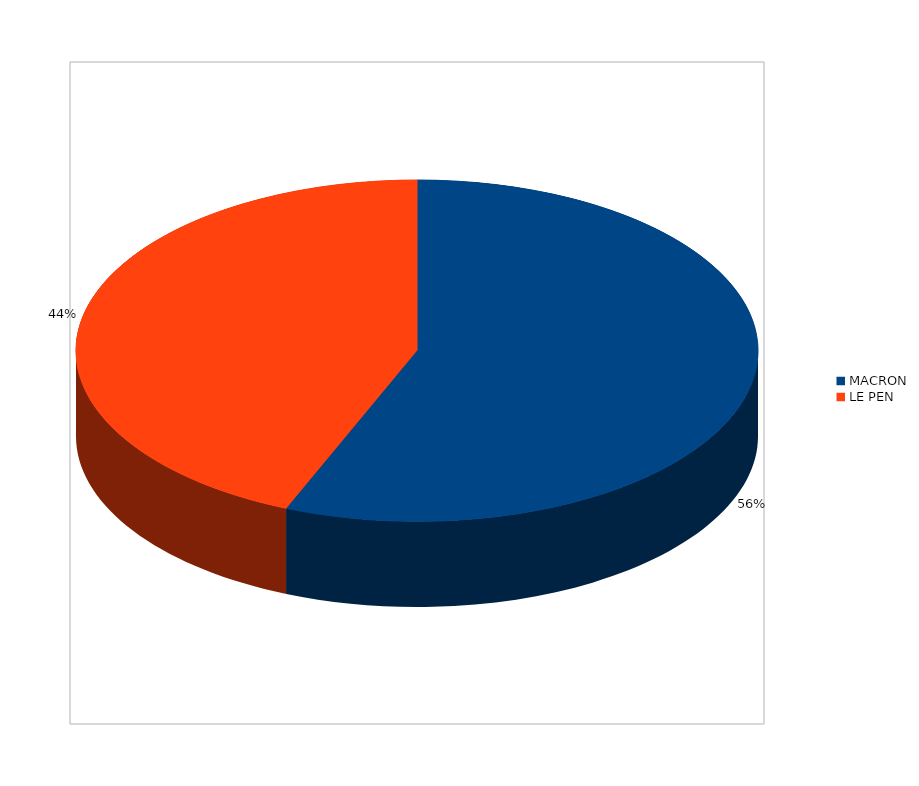
| Category | Series 0 |
|---|---|
| MACRON | 1915 |
| LE PEN | 1489 |